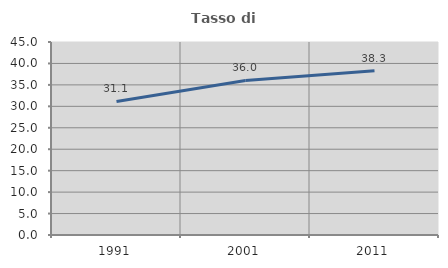
| Category | Tasso di occupazione   |
|---|---|
| 1991.0 | 31.143 |
| 2001.0 | 36.034 |
| 2011.0 | 38.27 |